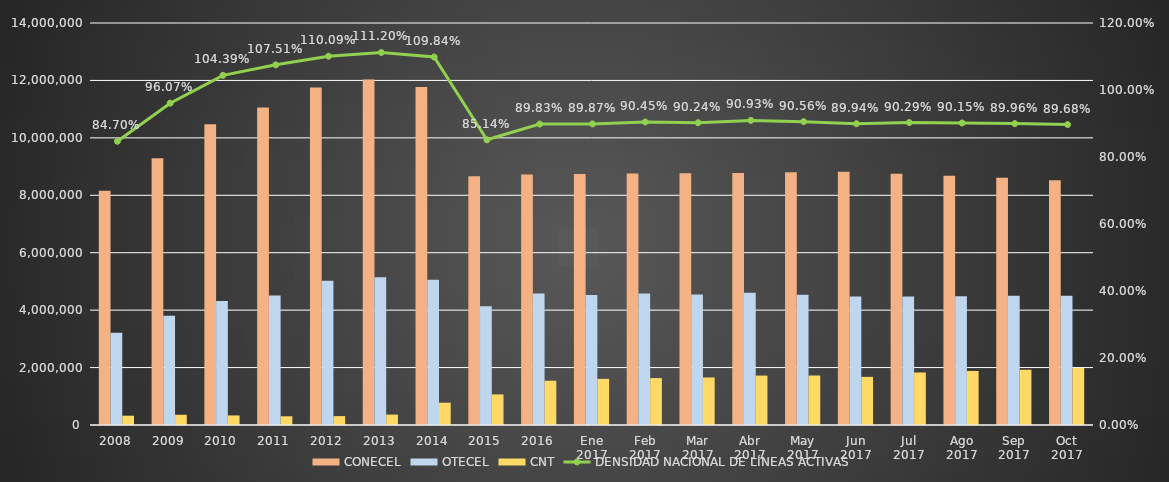
| Category | CONECEL | OTECEL | CNT |
|---|---|---|---|
| 2008 | 8156359 | 3211922 | 323967 |
| 2009 | 9291268 | 3806432 | 356900 |
| 2010 | 10470502 | 4314599 | 333730 |
| 2011 | 11057316 | 4513874 | 303368 |
| 2012 | 11757906 | 5019686 | 309271 |
| 2013 | 12030886 | 5148308 | 362560 |
| 2014 | 11772020 | 5055645 | 776892 |
| 2015 | 8658619 | 4134698 | 1065703 |
| 2016 | 8726823 | 4580092 | 1541219 |
| Ene 2017 | 8740818.931 | 4525750 | 1606657 |
| Feb 2017 | 8756687 | 4578932 | 1633862 |
| Mar 2017 | 8770831 | 4545105 | 1655131 |
| Abr 2017 | 8779728 | 4603330 | 1721409 |
| May 2017 | 8801222 | 4537153 | 1723483 |
| Jun 2017 | 8821576 | 4479049 | 1676146 |
| Jul 2017 | 8751597 | 4474456 | 1829157 |
| Ago 2017 | 8682033 | 4485802 | 1882162 |
| Sep 2017 | 8611553 | 4501316 | 1924352 |
| Oct 2017 | 8521547 | 4501316 | 1985926 |